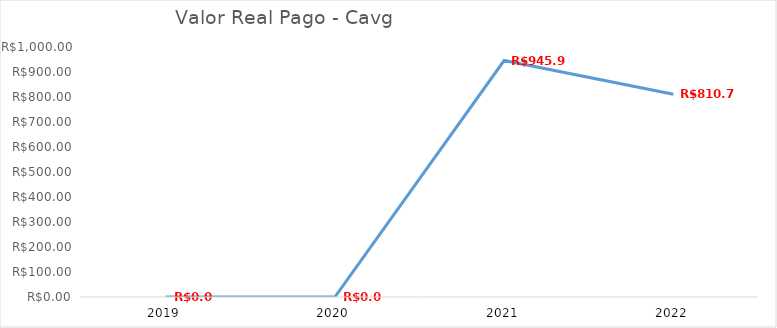
| Category | Series 0 |
|---|---|
| 2019.0 | 0 |
| 2020.0 | 0 |
| 2021.0 | 945.91 |
| 2022.0 | 810.78 |